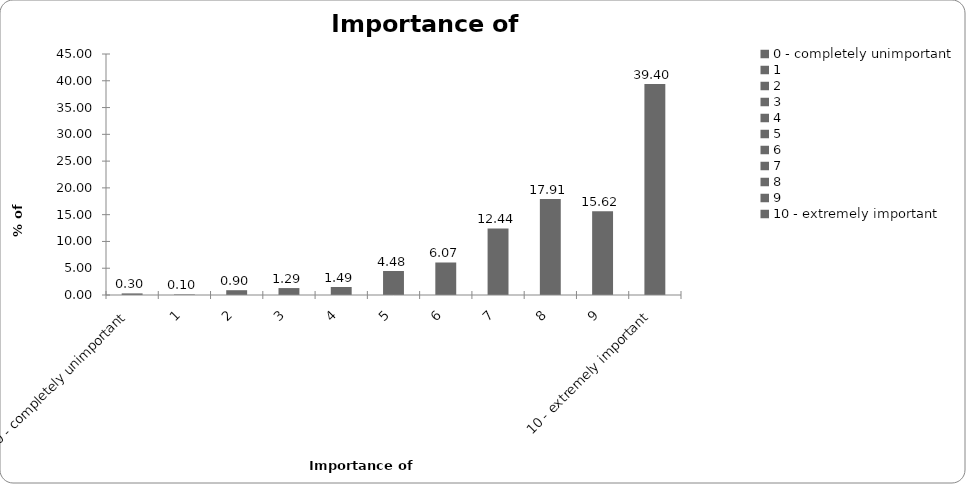
| Category | Importance of insurance |
|---|---|
| 0 - completely unimportant | 0.299 |
| 1 | 0.1 |
| 2 | 0.896 |
| 3 | 1.294 |
| 4 | 1.493 |
| 5 | 4.478 |
| 6 | 6.07 |
| 7 | 12.438 |
| 8 | 17.91 |
| 9 | 15.622 |
| 10 - extremely important | 39.403 |